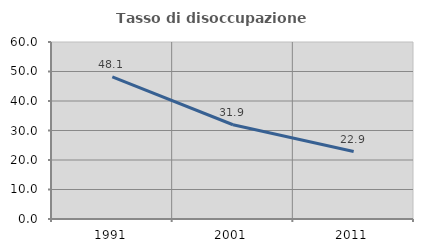
| Category | Tasso di disoccupazione giovanile  |
|---|---|
| 1991.0 | 48.148 |
| 2001.0 | 31.944 |
| 2011.0 | 22.857 |